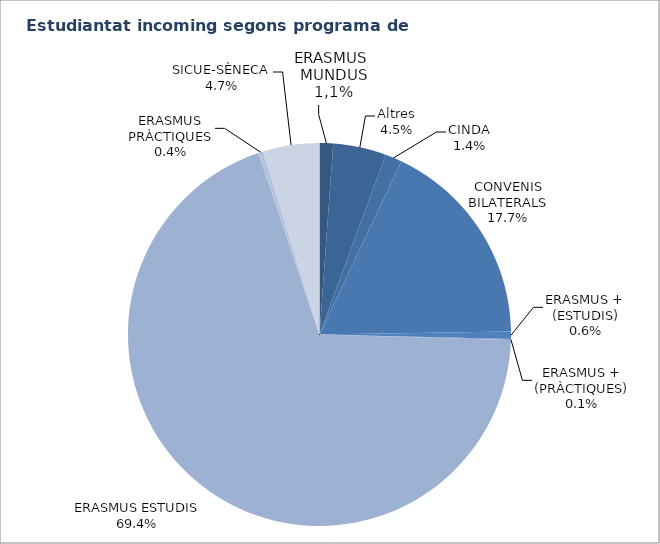
| Category | Series 0 |
|---|---|
| ERASMUS MUNDUS | 13 |
| Altres | 51 |
| CINDA | 16 |
| CONVENIS BILATERALS | 202 |
| ERASMUS + (ESTUDIS) | 7 |
| ERASMUS + (PRÀCTIQUES) | 1 |
| ERASMUS ESTUDIS | 790 |
| ERASMUS PRÀCTIQUES | 5 |
| SICUE-SÈNECA | 54 |